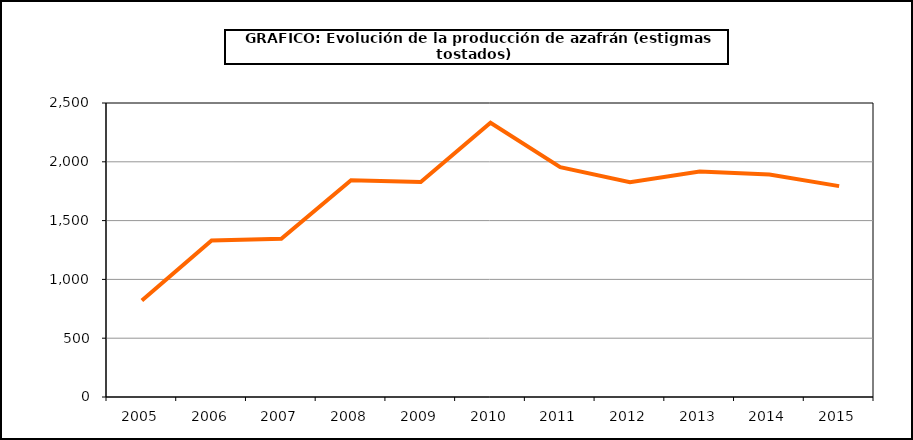
| Category | Producción |
|---|---|
| 2005.0 | 820 |
| 2006.0 | 1330 |
| 2007.0 | 1345 |
| 2008.0 | 1843 |
| 2009.0 | 1829 |
| 2010.0 | 2332 |
| 2011.0 | 1954 |
| 2012.0 | 1827 |
| 2013.0 | 1918 |
| 2014.0 | 1892 |
| 2015.0 | 1793 |